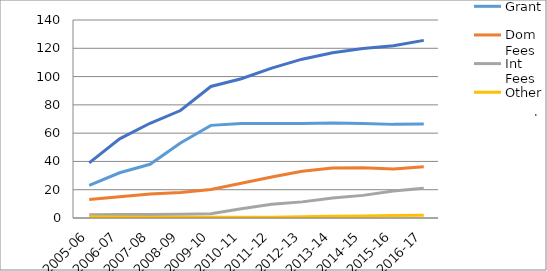
| Category | Grant | Dom Fees | Int Fees | Other | Total |
|---|---|---|---|---|---|
| 2005-06 | 23 | 13 | 2.3 | 0.9 | 39 |
| 2006-07 | 32 | 15 | 2.4 | 0.7 | 56 |
| 2007-08 | 38 | 17 | 2.5 | 0.5 | 67 |
| 2008-09 | 53 | 18 | 2.6 | 0.5 | 76 |
| 2009-10 | 65.5 | 20.1 | 3 | 0.5 | 93 |
| 2010-11 | 66.8 | 24.6 | 6.6 | 0.5 | 98.5 |
| 2011-12 | 66.8 | 29 | 9.7 | 0.5 | 106 |
| 2012-13 | 66.9 | 33.1 | 11.4 | 0.8 | 112.3 |
| 2013-14 | 67.2 | 35.3 | 14.2 | 1.2 | 116.9 |
| 2014-15 | 66.9 | 35.5 | 16 | 1.4 | 119.8 |
| 2015-16 | 66.2 | 34.7 | 19.1 | 1.8 | 121.8 |
| 2016-17 | 66.4 | 36.2 | 21 | 2 | 125.6 |